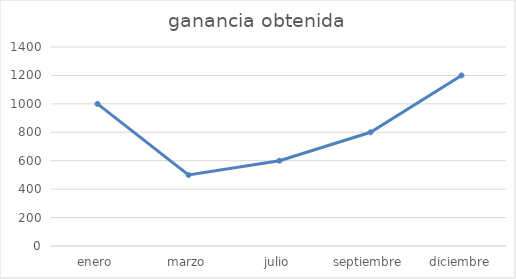
| Category | ganancia obtenida |
|---|---|
| enero | 1000 |
| marzo | 500 |
| julio | 600 |
| septiembre | 800 |
| diciembre | 1200 |